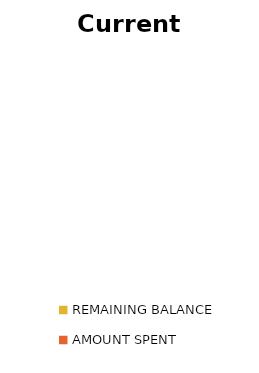
| Category | Current Balance |
|---|---|
| REMAINING BALANCE | 0 |
| AMOUNT SPENT | 0 |